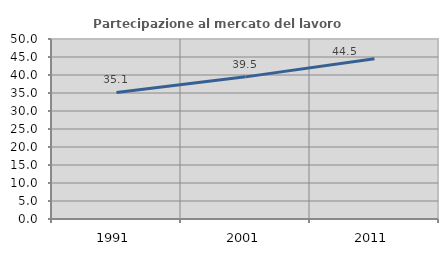
| Category | Partecipazione al mercato del lavoro  femminile |
|---|---|
| 1991.0 | 35.15 |
| 2001.0 | 39.483 |
| 2011.0 | 44.54 |